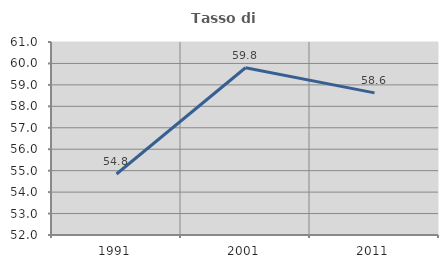
| Category | Tasso di occupazione   |
|---|---|
| 1991.0 | 54.845 |
| 2001.0 | 59.798 |
| 2011.0 | 58.628 |